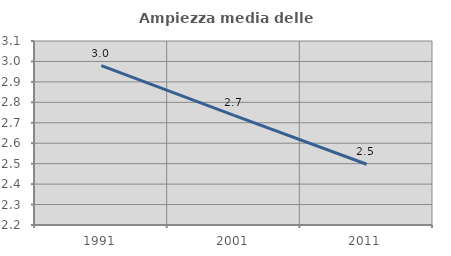
| Category | Ampiezza media delle famiglie |
|---|---|
| 1991.0 | 2.98 |
| 2001.0 | 2.736 |
| 2011.0 | 2.497 |